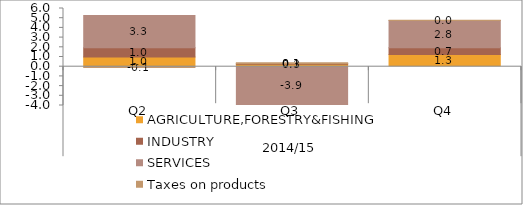
| Category | AGRICULTURE,FORESTRY&FISHING | INDUSTRY | SERVICES | Taxes on products |
|---|---|---|---|---|
| 0 | 0.995 | 0.972 | 3.303 | -0.081 |
| 1 | 0.251 | 0.071 | -3.909 | 0.084 |
| 2 | 1.269 | 0.686 | 2.797 | 0.031 |